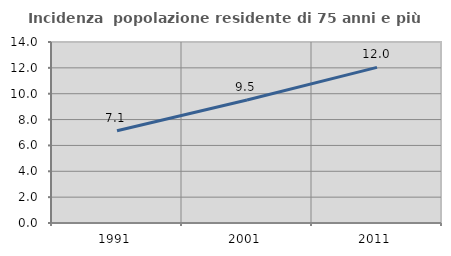
| Category | Incidenza  popolazione residente di 75 anni e più |
|---|---|
| 1991.0 | 7.141 |
| 2001.0 | 9.514 |
| 2011.0 | 12.037 |